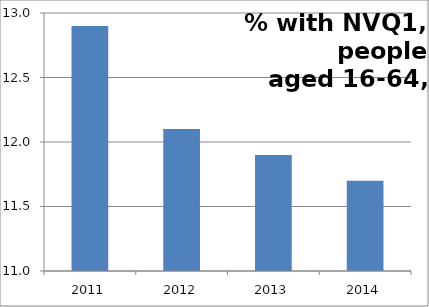
| Category | % with NVQ1 only - aged 16-64 |
|---|---|
| 2011.0 | 12.9 |
| 2012.0 | 12.1 |
| 2013.0 | 11.9 |
| 2014.0 | 11.7 |